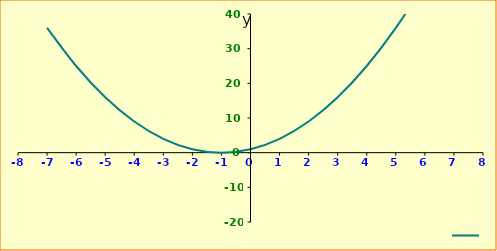
| Category | y |
|---|---|
| -7.0 | 36 |
| -6.0 | 25 |
| -5.0 | 16 |
| -4.0 | 9 |
| -3.0 | 4 |
| -2.0 | 1 |
| -1.0 | 0 |
| 0.0 | 1 |
| 1.0 | 4 |
| 2.0 | 9 |
| 3.0 | 16 |
| 4.0 | 25 |
| 5.0 | 36 |
| 6.0 | 49 |
| 7.0 | 64 |